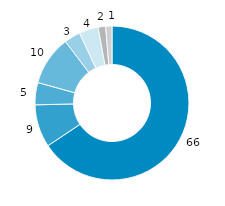
| Category | Sachsen |
|---|---|
| gesetzliche
Kranken-versicherung | 65.638 |
| private Haushalte u. private Organi-sationen o. E. | 8.984 |
| private
Kranken-versicherung | 4.657 |
| soziale Pflegeversicherung | 10.405 |
| öffentliche Haushalte | 3.404 |
| Arbeitgeber | 4.025 |
| gesetzliche Unfallversicherung | 1.573 |
| gesetzliche
Renten-
versicherung | 1.313 |